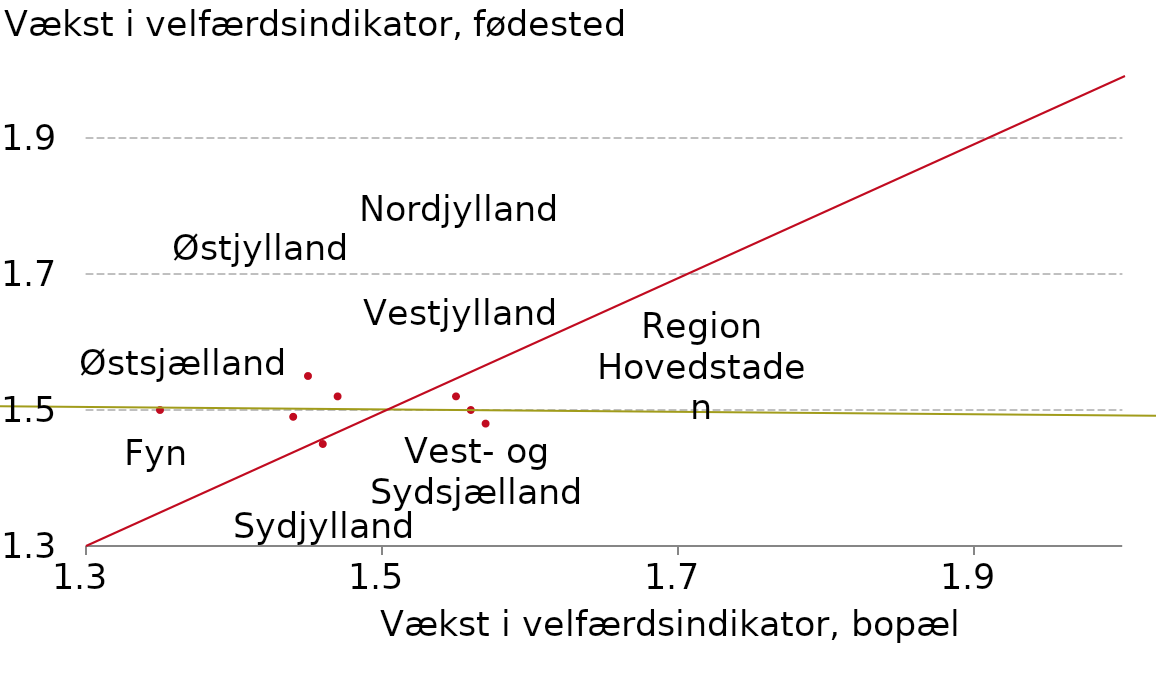
| Category |  Serie1 |
|---|---|
| 1.35 | 1.5 |
| 1.47 | 1.52 |
| 1.57 | 1.48 |
| 1.46 | 1.45 |
| 1.56 | 1.5 |
| 1.55 | 1.52 |
| 1.45 | 1.55 |
| 1.44 | 1.49 |